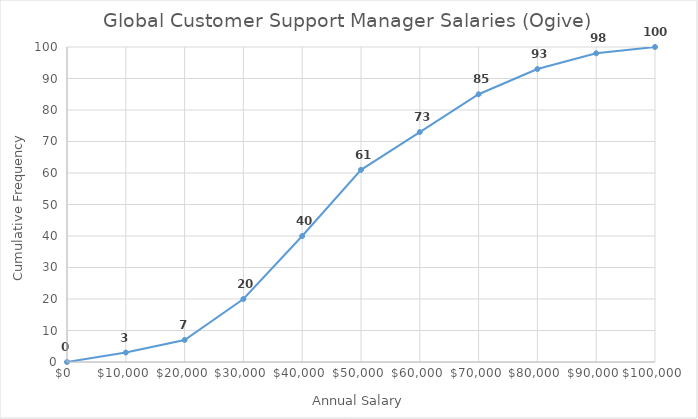
| Category | Series 0 |
|---|---|
| 0.0 | 0 |
| 10000.0 | 3 |
| 20000.0 | 7 |
| 30000.0 | 20 |
| 40000.0 | 40 |
| 50000.0 | 61 |
| 60000.0 | 73 |
| 70000.0 | 85 |
| 80000.0 | 93 |
| 90000.0 | 98 |
| 100000.0 | 100 |